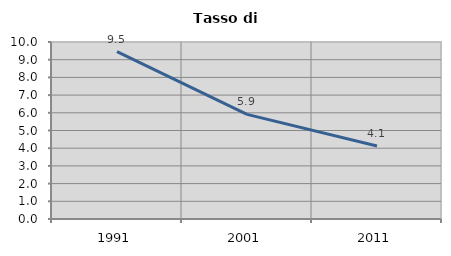
| Category | Tasso di disoccupazione   |
|---|---|
| 1991.0 | 9.456 |
| 2001.0 | 5.911 |
| 2011.0 | 4.12 |